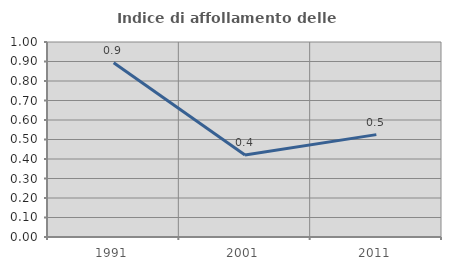
| Category | Indice di affollamento delle abitazioni  |
|---|---|
| 1991.0 | 0.893 |
| 2001.0 | 0.421 |
| 2011.0 | 0.525 |